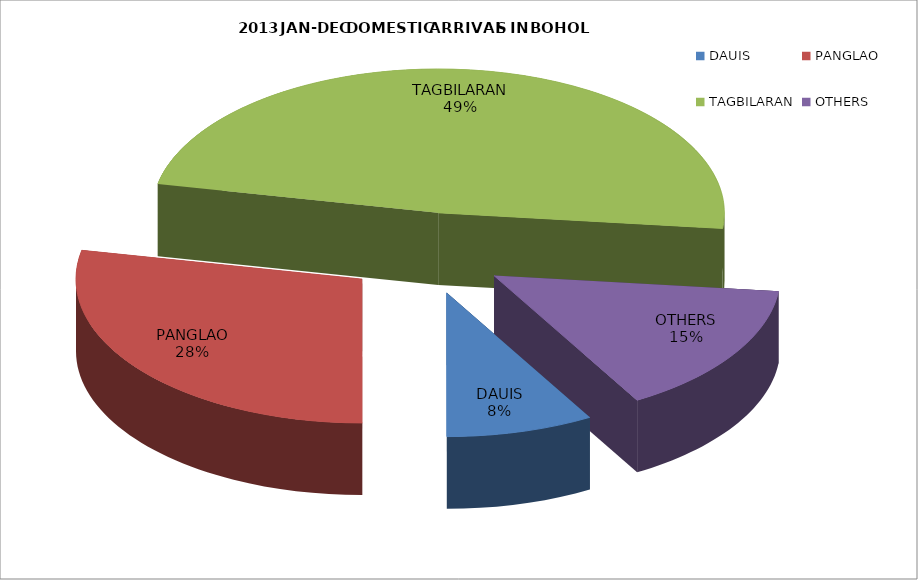
| Category | Series 0 |
|---|---|
| DAUIS | 23309 |
| PANGLAO | 78996 |
| TAGBILARAN | 135849 |
| OTHERS | 41805 |